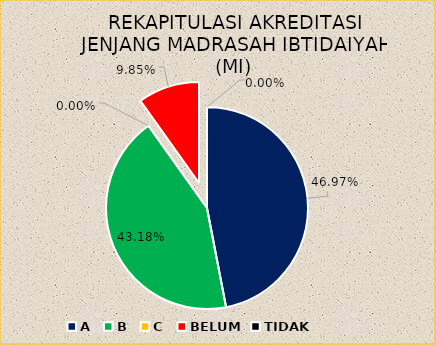
| Category | REKAPITULASI AKREDITASI JENJANG MADRASAH IBTIDAIYAH (MI) |
|---|---|
| A | 62 |
| B | 57 |
| C | 0 |
| BELUM | 13 |
| TIDAK | 0 |